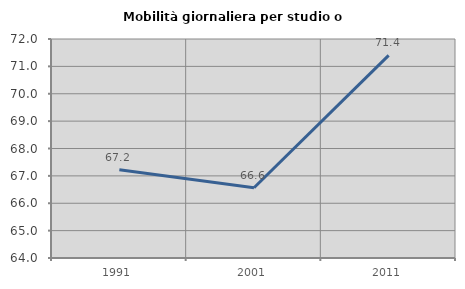
| Category | Mobilità giornaliera per studio o lavoro |
|---|---|
| 1991.0 | 67.225 |
| 2001.0 | 66.568 |
| 2011.0 | 71.4 |